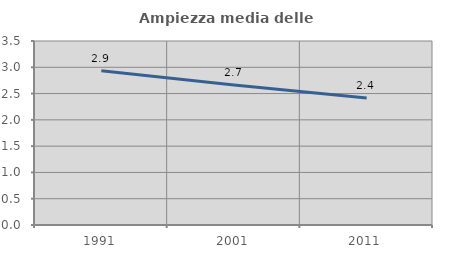
| Category | Ampiezza media delle famiglie |
|---|---|
| 1991.0 | 2.936 |
| 2001.0 | 2.664 |
| 2011.0 | 2.415 |